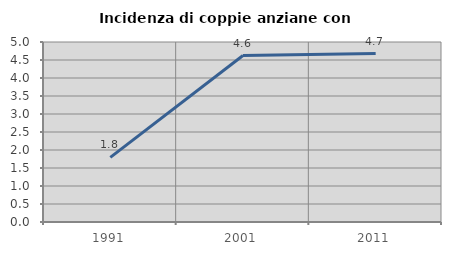
| Category | Incidenza di coppie anziane con figli |
|---|---|
| 1991.0 | 1.796 |
| 2001.0 | 4.624 |
| 2011.0 | 4.678 |